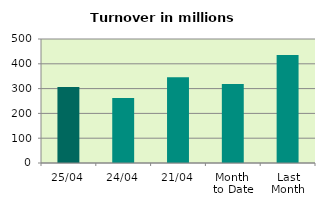
| Category | Series 0 |
|---|---|
| 25/04 | 306 |
| 24/04 | 262.069 |
| 21/04 | 345.867 |
| Month 
to Date | 318.092 |
| Last
Month | 435.216 |